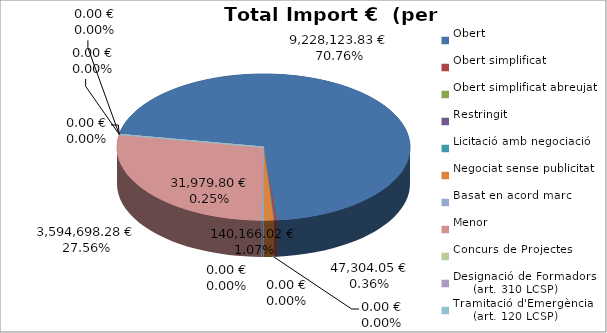
| Category | Total preu
(amb IVA) |
|---|---|
| Obert | 9228123.83 |
| Obert simplificat | 47304.05 |
| Obert simplificat abreujat | 0 |
| Restringit | 0 |
| Licitació amb negociació | 0 |
| Negociat sense publicitat | 140166.02 |
| Basat en acord marc | 31979.8 |
| Menor | 3594698.276 |
| Concurs de Projectes | 0 |
| Designació de Formadors
     (art. 310 LCSP) | 0 |
| Tramitació d'Emergència
     (art. 120 LCSP) | 0 |